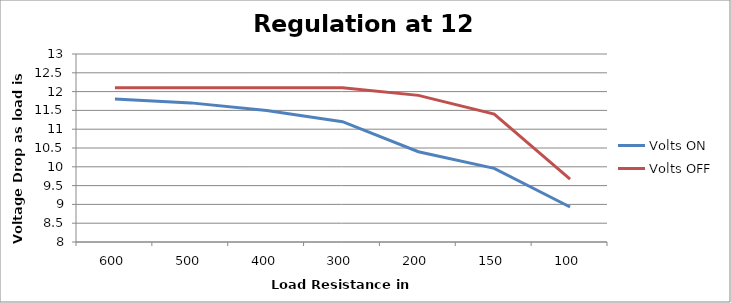
| Category | Volts ON | Volts OFF |
|---|---|---|
| 600.0 | 11.8 | 12.1 |
| 500.0 | 11.7 | 12.1 |
| 400.0 | 11.5 | 12.1 |
| 300.0 | 11.2 | 12.1 |
| 200.0 | 10.4 | 11.9 |
| 150.0 | 9.96 | 11.4 |
| 100.0 | 8.93 | 9.67 |